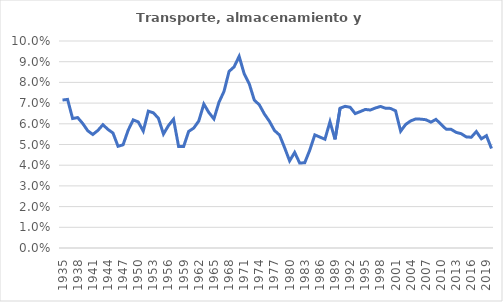
| Category | Transporte, almacenamiento y comunicaciones |
|---|---|
| 1935.0 | 0.071 |
| 1936.0 | 0.072 |
| 1937.0 | 0.063 |
| 1938.0 | 0.063 |
| 1939.0 | 0.06 |
| 1940.0 | 0.057 |
| 1941.0 | 0.055 |
| 1942.0 | 0.057 |
| 1943.0 | 0.06 |
| 1944.0 | 0.057 |
| 1945.0 | 0.056 |
| 1946.0 | 0.049 |
| 1947.0 | 0.05 |
| 1948.0 | 0.057 |
| 1949.0 | 0.062 |
| 1950.0 | 0.061 |
| 1951.0 | 0.056 |
| 1952.0 | 0.066 |
| 1953.0 | 0.065 |
| 1954.0 | 0.063 |
| 1955.0 | 0.055 |
| 1956.0 | 0.059 |
| 1957.0 | 0.062 |
| 1958.0 | 0.049 |
| 1959.0 | 0.049 |
| 1960.0 | 0.056 |
| 1961.0 | 0.058 |
| 1962.0 | 0.061 |
| 1963.0 | 0.07 |
| 1964.0 | 0.065 |
| 1965.0 | 0.062 |
| 1966.0 | 0.07 |
| 1967.0 | 0.076 |
| 1968.0 | 0.085 |
| 1969.0 | 0.088 |
| 1970.0 | 0.093 |
| 1971.0 | 0.084 |
| 1972.0 | 0.079 |
| 1973.0 | 0.071 |
| 1974.0 | 0.069 |
| 1975.0 | 0.065 |
| 1976.0 | 0.061 |
| 1977.0 | 0.057 |
| 1978.0 | 0.055 |
| 1979.0 | 0.049 |
| 1980.0 | 0.042 |
| 1981.0 | 0.046 |
| 1982.0 | 0.041 |
| 1983.0 | 0.041 |
| 1984.0 | 0.047 |
| 1985.0 | 0.055 |
| 1986.0 | 0.054 |
| 1987.0 | 0.053 |
| 1988.0 | 0.061 |
| 1989.0 | 0.052 |
| 1990.0 | 0.068 |
| 1991.0 | 0.068 |
| 1992.0 | 0.068 |
| 1993.0 | 0.065 |
| 1994.0 | 0.066 |
| 1995.0 | 0.067 |
| 1996.0 | 0.067 |
| 1997.0 | 0.068 |
| 1998.0 | 0.068 |
| 1999.0 | 0.068 |
| 2000.0 | 0.067 |
| 2001.0 | 0.066 |
| 2002.0 | 0.056 |
| 2003.0 | 0.06 |
| 2004.0 | 0.061 |
| 2005.0 | 0.062 |
| 2006.0 | 0.062 |
| 2007.0 | 0.062 |
| 2008.0 | 0.061 |
| 2009.0 | 0.062 |
| 2010.0 | 0.06 |
| 2011.0 | 0.057 |
| 2012.0 | 0.057 |
| 2013.0 | 0.056 |
| 2014.0 | 0.055 |
| 2015.0 | 0.054 |
| 2016.0 | 0.054 |
| 2017.0 | 0.056 |
| 2018.0 | 0.053 |
| 2019.0 | 0.054 |
| 2020.0 | 0.048 |